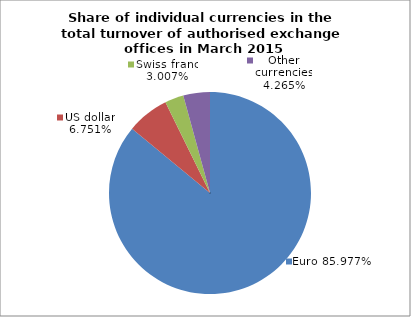
| Category | EUR |
|---|---|
| 0 | 0.86 |
| 1 | 0.068 |
| 2 | 0.03 |
| 3 | 0.043 |